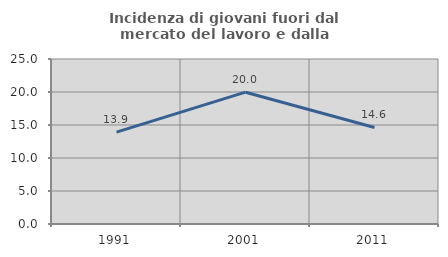
| Category | Incidenza di giovani fuori dal mercato del lavoro e dalla formazione  |
|---|---|
| 1991.0 | 13.916 |
| 2001.0 | 19.972 |
| 2011.0 | 14.626 |